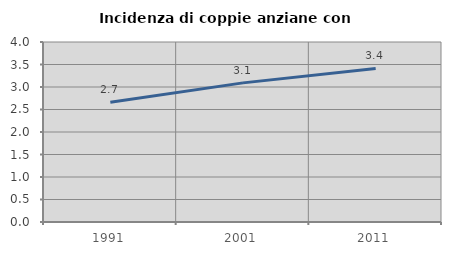
| Category | Incidenza di coppie anziane con figli |
|---|---|
| 1991.0 | 2.661 |
| 2001.0 | 3.091 |
| 2011.0 | 3.413 |